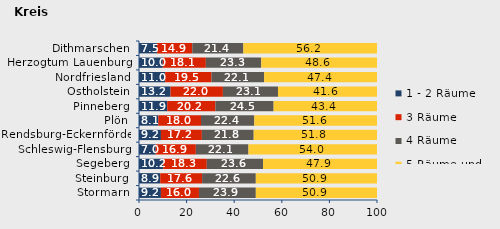
| Category | 1 - 2 Räume | 3 Räume | 4 Räume | 5 Räume und mehr |
|---|---|---|---|---|
| Stormarn | 9.209 | 15.981 | 23.894 | 50.917 |
| Steinburg | 8.92 | 17.597 | 22.562 | 50.921 |
| Segeberg | 10.167 | 18.319 | 23.628 | 47.886 |
| Schleswig-Flensburg | 7.014 | 16.877 | 22.092 | 54.017 |
| Rendsburg-Eckernförde | 9.218 | 17.199 | 21.775 | 51.808 |
| Plön | 8.104 | 17.953 | 22.391 | 51.553 |
| Pinneberg | 11.861 | 20.226 | 24.475 | 43.437 |
| Ostholstein | 13.231 | 22.025 | 23.142 | 41.602 |
| Nordfriesland | 10.98 | 19.474 | 22.133 | 47.412 |
| Herzogtum Lauenburg | 9.992 | 18.101 | 23.271 | 48.636 |
| Dithmarschen | 7.532 | 14.862 | 21.449 | 56.156 |